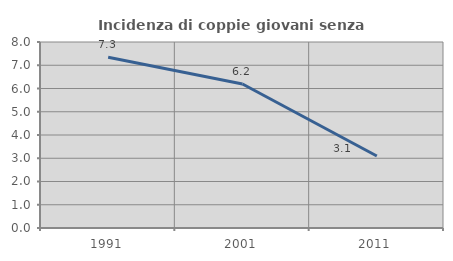
| Category | Incidenza di coppie giovani senza figli |
|---|---|
| 1991.0 | 7.341 |
| 2001.0 | 6.193 |
| 2011.0 | 3.097 |